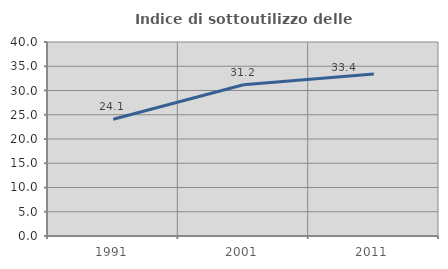
| Category | Indice di sottoutilizzo delle abitazioni  |
|---|---|
| 1991.0 | 24.08 |
| 2001.0 | 31.197 |
| 2011.0 | 33.401 |